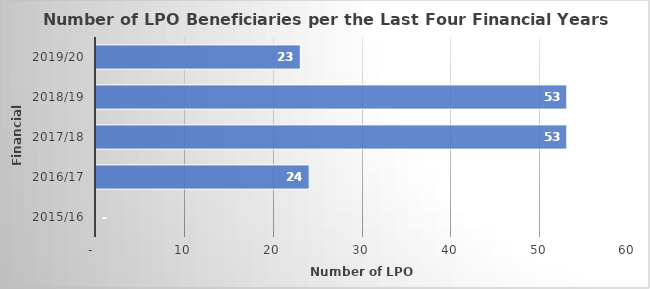
| Category |  GRAND TOTAL  |
|---|---|
| 2015/16 | 0 |
| 2016/17 | 24 |
| 2017/18 | 53 |
| 2018/19 | 53 |
| 2019/20 | 23 |